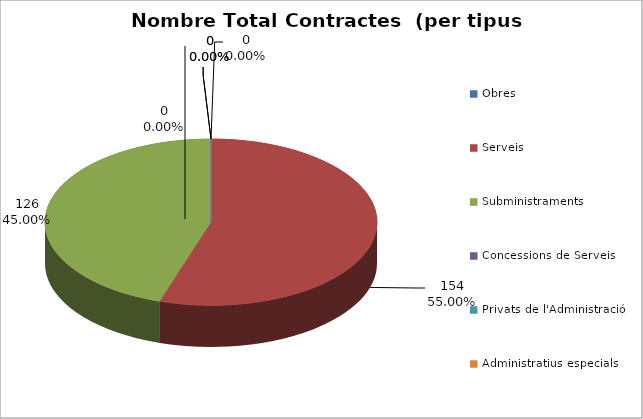
| Category | Nombre Total Contractes |
|---|---|
| Obres | 0 |
| Serveis | 154 |
| Subministraments | 126 |
| Concessions de Serveis | 0 |
| Privats de l'Administració | 0 |
| Administratius especials | 0 |